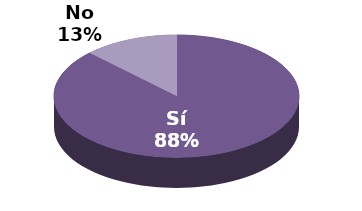
| Category | Series 1 |
|---|---|
| Sí | 7 |
| No | 1 |